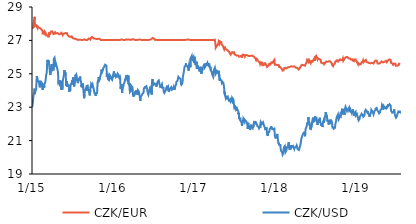
| Category | CZK/EUR | CZK/USD |
|---|---|---|
| 2015-01-02 | 27.7 | 23.001 |
| 2015-01-05 | 27.675 | 23.225 |
| 2015-01-06 | 27.695 | 23.249 |
| 2015-01-07 | 27.785 | 23.505 |
| 2015-01-08 | 27.865 | 23.68 |
| 2015-01-09 | 28.06 | 23.752 |
| 2015-01-12 | 28.29 | 23.965 |
| 2015-01-13 | 28.41 | 24.112 |
| 2015-01-14 | 28.23 | 23.975 |
| 2015-01-15 | 27.84 | 23.783 |
| 2015-01-16 | 27.79 | 23.977 |
| 2015-01-19 | 27.88 | 24.015 |
| 2015-01-20 | 27.845 | 24.049 |
| 2015-01-21 | 27.945 | 24.104 |
| 2015-01-22 | 27.9 | 24.013 |
| 2015-01-23 | 27.835 | 24.859 |
| 2015-01-26 | 27.755 | 24.68 |
| 2015-01-27 | 27.865 | 24.643 |
| 2015-01-28 | 27.84 | 24.543 |
| 2015-01-29 | 27.8 | 24.562 |
| 2015-01-30 | 27.795 | 24.585 |
| 2015-02-02 | 27.75 | 24.537 |
| 2015-02-03 | 27.75 | 24.388 |
| 2015-02-04 | 27.77 | 24.261 |
| 2015-02-05 | 27.73 | 24.304 |
| 2015-02-06 | 27.695 | 24.19 |
| 2015-02-09 | 27.72 | 24.58 |
| 2015-02-10 | 27.725 | 24.541 |
| 2015-02-11 | 27.68 | 24.462 |
| 2015-02-12 | 27.705 | 24.455 |
| 2015-02-13 | 27.64 | 24.285 |
| 2015-02-16 | 27.64 | 24.224 |
| 2015-02-17 | 27.62 | 24.192 |
| 2015-02-18 | 27.58 | 24.254 |
| 2015-02-19 | 27.37 | 24.033 |
| 2015-02-20 | 27.505 | 24.344 |
| 2015-02-23 | 27.445 | 24.291 |
| 2015-02-24 | 27.48 | 24.257 |
| 2015-02-25 | 27.42 | 24.165 |
| 2015-02-26 | 27.51 | 24.306 |
| 2015-02-27 | 27.43 | 24.401 |
| 2015-03-02 | 27.49 | 24.48 |
| 2015-03-03 | 27.45 | 24.576 |
| 2015-03-04 | 27.465 | 24.683 |
| 2015-03-05 | 27.42 | 24.77 |
| 2015-03-06 | 27.3 | 24.899 |
| 2015-03-09 | 27.25 | 25.093 |
| 2015-03-10 | 27.285 | 25.397 |
| 2015-03-11 | 27.29 | 25.8 |
| 2015-03-12 | 27.305 | 25.735 |
| 2015-03-13 | 27.31 | 25.832 |
| 2015-03-16 | 27.305 | 25.856 |
| 2015-03-17 | 27.185 | 25.565 |
| 2015-03-18 | 27.32 | 25.797 |
| 2015-03-19 | 27.425 | 25.687 |
| 2015-03-20 | 27.48 | 25.5 |
| 2015-03-23 | 27.375 | 25.091 |
| 2015-03-24 | 27.39 | 25.017 |
| 2015-03-25 | 27.375 | 24.923 |
| 2015-03-26 | 27.385 | 24.951 |
| 2015-03-27 | 27.525 | 25.345 |
| 2015-03-30 | 27.475 | 25.333 |
| 2015-03-31 | 27.53 | 25.586 |
| 2015-04-01 | 27.545 | 25.563 |
| 2015-04-02 | 27.57 | 25.456 |
| 2015-04-03 | 27.54 | 25.232 |
| 2015-04-07 | 27.46 | 25.315 |
| 2015-04-08 | 27.375 | 25.205 |
| 2015-04-09 | 27.375 | 25.407 |
| 2015-04-10 | 27.38 | 25.901 |
| 2015-04-13 | 27.395 | 25.963 |
| 2015-04-14 | 27.345 | 25.886 |
| 2015-04-15 | 27.415 | 25.911 |
| 2015-04-16 | 27.485 | 25.662 |
| 2015-04-17 | 27.485 | 25.41 |
| 2015-04-20 | 27.42 | 25.569 |
| 2015-04-21 | 27.42 | 25.627 |
| 2015-04-22 | 27.465 | 25.568 |
| 2015-04-23 | 27.4 | 25.434 |
| 2015-04-24 | 27.455 | 25.366 |
| 2015-04-27 | 27.44 | 25.343 |
| 2015-04-28 | 27.47 | 25.14 |
| 2015-04-29 | 27.435 | 24.939 |
| 2015-04-30 | 27.43 | 24.46 |
| 2015-05-04 | 27.365 | 24.535 |
| 2015-05-05 | 27.36 | 24.61 |
| 2015-05-06 | 27.415 | 24.41 |
| 2015-05-07 | 27.405 | 24.255 |
| 2015-05-11 | 27.395 | 24.582 |
| 2015-05-12 | 27.395 | 24.374 |
| 2015-05-13 | 27.455 | 24.465 |
| 2015-05-14 | 27.455 | 24.038 |
| 2015-05-15 | 27.4 | 24.185 |
| 2015-05-18 | 27.4 | 24.059 |
| 2015-05-19 | 27.355 | 24.471 |
| 2015-05-20 | 27.33 | 24.577 |
| 2015-05-21 | 27.35 | 24.57 |
| 2015-05-22 | 27.395 | 24.543 |
| 2015-05-25 | 27.37 | 24.931 |
| 2015-05-26 | 27.395 | 25.072 |
| 2015-05-27 | 27.405 | 25.226 |
| 2015-05-28 | 27.46 | 25.203 |
| 2015-05-29 | 27.41 | 24.978 |
| 2015-06-01 | 27.44 | 25.078 |
| 2015-06-02 | 27.44 | 24.883 |
| 2015-06-03 | 27.46 | 24.704 |
| 2015-06-04 | 27.465 | 24.263 |
| 2015-06-05 | 27.395 | 24.426 |
| 2015-06-08 | 27.43 | 24.56 |
| 2015-06-09 | 27.36 | 24.328 |
| 2015-06-10 | 27.32 | 24.22 |
| 2015-06-11 | 27.315 | 24.331 |
| 2015-06-12 | 27.3 | 24.328 |
| 2015-06-15 | 27.28 | 24.319 |
| 2015-06-16 | 27.255 | 24.309 |
| 2015-06-17 | 27.24 | 24.148 |
| 2015-06-18 | 27.275 | 23.92 |
| 2015-06-19 | 27.21 | 24.08 |
| 2015-06-22 | 27.205 | 23.981 |
| 2015-06-23 | 27.19 | 24.266 |
| 2015-06-24 | 27.205 | 24.26 |
| 2015-06-25 | 27.23 | 24.297 |
| 2015-06-26 | 27.23 | 24.306 |
| 2015-06-29 | 27.245 | 24.473 |
| 2015-06-30 | 27.245 | 24.347 |
| 2015-07-01 | 27.245 | 24.557 |
| 2015-07-02 | 27.265 | 24.633 |
| 2015-07-03 | 27.14 | 24.46 |
| 2015-07-07 | 27.1 | 24.793 |
| 2015-07-08 | 27.115 | 24.592 |
| 2015-07-09 | 27.11 | 24.528 |
| 2015-07-10 | 27.125 | 24.238 |
| 2015-07-13 | 27.1 | 24.522 |
| 2015-07-14 | 27.08 | 24.55 |
| 2015-07-15 | 27.075 | 24.59 |
| 2015-07-16 | 27.11 | 24.946 |
| 2015-07-17 | 27.055 | 24.843 |
| 2015-07-20 | 27.07 | 24.94 |
| 2015-07-21 | 27.07 | 24.908 |
| 2015-07-22 | 27.065 | 24.827 |
| 2015-07-23 | 27.04 | 24.581 |
| 2015-07-24 | 27.045 | 24.72 |
| 2015-07-27 | 27.03 | 24.444 |
| 2015-07-28 | 27.025 | 24.504 |
| 2015-07-29 | 27.065 | 24.539 |
| 2015-07-30 | 27.05 | 24.691 |
| 2015-07-31 | 27.03 | 24.648 |
| 2015-08-03 | 27.04 | 24.687 |
| 2015-08-04 | 27.055 | 24.649 |
| 2015-08-05 | 27.04 | 24.769 |
| 2015-08-06 | 27.03 | 24.833 |
| 2015-08-07 | 27.025 | 24.706 |
| 2015-08-10 | 27.035 | 24.664 |
| 2015-08-11 | 27.03 | 24.448 |
| 2015-08-12 | 27.02 | 24.227 |
| 2015-08-13 | 27.025 | 24.322 |
| 2015-08-14 | 27.02 | 24.189 |
| 2015-08-17 | 27.02 | 24.339 |
| 2015-08-18 | 27.02 | 24.427 |
| 2015-08-19 | 27.022 | 24.475 |
| 2015-08-20 | 27.023 | 24.163 |
| 2015-08-21 | 27.021 | 23.952 |
| 2015-08-24 | 27.065 | 23.538 |
| 2015-08-25 | 27.11 | 23.564 |
| 2015-08-26 | 27.085 | 23.754 |
| 2015-08-27 | 27.1 | 24.022 |
| 2015-08-28 | 27.05 | 23.999 |
| 2015-08-31 | 27.03 | 24.098 |
| 2015-09-01 | 27.02 | 24.04 |
| 2015-09-02 | 27.02 | 23.987 |
| 2015-09-03 | 27.025 | 24.069 |
| 2015-09-04 | 27.03 | 24.265 |
| 2015-09-07 | 27.025 | 24.249 |
| 2015-09-08 | 27.045 | 24.231 |
| 2015-09-09 | 27.06 | 24.292 |
| 2015-09-10 | 27.04 | 24.17 |
| 2015-09-11 | 27.075 | 24.021 |
| 2015-09-14 | 27.115 | 23.984 |
| 2015-09-15 | 27.085 | 23.922 |
| 2015-09-16 | 27.06 | 24.096 |
| 2015-09-17 | 27.11 | 23.967 |
| 2015-09-18 | 27.07 | 23.707 |
| 2015-09-21 | 27.05 | 24.047 |
| 2015-09-22 | 27.06 | 24.258 |
| 2015-09-23 | 27.09 | 24.291 |
| 2015-09-24 | 27.16 | 24.16 |
| 2015-09-25 | 27.19 | 24.387 |
| 2015-09-29 | 27.21 | 24.286 |
| 2015-09-30 | 27.18 | 24.266 |
| 2015-10-01 | 27.17 | 24.356 |
| 2015-10-02 | 27.16 | 24.334 |
| 2015-10-05 | 27.12 | 24.132 |
| 2015-10-06 | 27.11 | 24.154 |
| 2015-10-07 | 27.095 | 24.051 |
| 2015-10-08 | 27.11 | 24.085 |
| 2015-10-09 | 27.11 | 23.856 |
| 2015-10-12 | 27.105 | 23.834 |
| 2015-10-13 | 27.13 | 23.853 |
| 2015-10-14 | 27.11 | 23.762 |
| 2015-10-15 | 27.08 | 23.677 |
| 2015-10-16 | 27.08 | 23.841 |
| 2015-10-19 | 27.085 | 23.898 |
| 2015-10-20 | 27.08 | 23.809 |
| 2015-10-21 | 27.08 | 23.852 |
| 2015-10-22 | 27.07 | 23.925 |
| 2015-10-23 | 27.075 | 24.45 |
| 2015-10-26 | 27.09 | 24.604 |
| 2015-10-27 | 27.1 | 24.504 |
| 2015-10-29 | 27.11 | 24.803 |
| 2015-10-30 | 27.09 | 24.594 |
| 2015-11-02 | 27.1 | 24.559 |
| 2015-11-03 | 27.1 | 24.689 |
| 2015-11-04 | 27.075 | 24.78 |
| 2015-11-05 | 27.045 | 24.853 |
| 2015-11-06 | 27.03 | 24.892 |
| 2015-11-09 | 27.04 | 25.09 |
| 2015-11-10 | 27.045 | 25.249 |
| 2015-11-11 | 27.025 | 25.218 |
| 2015-11-12 | 27.035 | 25.205 |
| 2015-11-13 | 27.03 | 25.107 |
| 2015-11-16 | 27.03 | 25.207 |
| 2015-11-18 | 27.03 | 25.34 |
| 2015-11-19 | 27.025 | 25.282 |
| 2015-11-20 | 27.03 | 25.289 |
| 2015-11-23 | 27.025 | 25.422 |
| 2015-11-24 | 27.03 | 25.376 |
| 2015-11-25 | 27.025 | 25.527 |
| 2015-11-26 | 27.03 | 25.463 |
| 2015-11-27 | 27.025 | 25.54 |
| 2015-11-30 | 27.03 | 25.545 |
| 2015-12-01 | 27.025 | 25.493 |
| 2015-12-02 | 27.025 | 25.492 |
| 2015-12-03 | 27.035 | 25.326 |
| 2015-12-04 | 27.035 | 24.802 |
| 2015-12-07 | 27.02 | 24.997 |
| 2015-12-08 | 27.02 | 24.841 |
| 2015-12-09 | 27.02 | 24.688 |
| 2015-12-10 | 27.02 | 24.69 |
| 2015-12-11 | 27.025 | 24.676 |
| 2015-12-14 | 27.02 | 24.62 |
| 2015-12-15 | 27.02 | 24.57 |
| 2015-12-16 | 27.03 | 24.726 |
| 2015-12-17 | 27.03 | 24.935 |
| 2015-12-18 | 27.03 | 24.947 |
| 2015-12-21 | 27.025 | 24.862 |
| 2015-12-22 | 27.03 | 24.679 |
| 2015-12-23 | 27.03 | 24.762 |
| 2015-12-28 | 27.02 | 24.645 |
| 2015-12-29 | 27.03 | 24.679 |
| 2015-12-30 | 27.025 | 24.728 |
| 2015-12-31 | 27.025 | 24.824 |
| 2016-01-04 | 27.02 | 24.794 |
| 2016-01-05 | 27.02 | 25.145 |
| 2016-01-06 | 27.025 | 25.196 |
| 2016-01-07 | 27.03 | 24.873 |
| 2016-01-08 | 27.02 | 24.873 |
| 2016-01-11 | 27.02 | 24.815 |
| 2016-01-12 | 27.02 | 24.937 |
| 2016-01-13 | 27.02 | 24.983 |
| 2016-01-14 | 27.02 | 24.804 |
| 2016-01-15 | 27.02 | 24.756 |
| 2016-01-18 | 27.035 | 24.821 |
| 2016-01-19 | 27.025 | 24.865 |
| 2016-01-20 | 27.04 | 24.789 |
| 2016-01-21 | 27.065 | 24.844 |
| 2016-01-22 | 27.025 | 25.002 |
| 2016-01-25 | 27.02 | 24.98 |
| 2016-01-26 | 27.02 | 24.928 |
| 2016-01-27 | 27.025 | 24.82 |
| 2016-01-28 | 27.02 | 24.78 |
| 2016-01-29 | 27.025 | 24.76 |
| 2016-02-01 | 27.02 | 24.823 |
| 2016-02-02 | 27.025 | 24.748 |
| 2016-02-03 | 27.02 | 24.72 |
| 2016-02-04 | 27.02 | 24.11 |
| 2016-02-05 | 27.035 | 24.134 |
| 2016-02-08 | 27.06 | 24.379 |
| 2016-02-09 | 27.06 | 24.09 |
| 2016-02-10 | 27.03 | 24.006 |
| 2016-02-11 | 27.07 | 23.857 |
| 2016-02-12 | 27.065 | 24.004 |
| 2016-02-15 | 27.035 | 24.182 |
| 2016-02-16 | 27.03 | 24.214 |
| 2016-02-17 | 27.03 | 24.276 |
| 2016-02-18 | 27.02 | 24.375 |
| 2016-02-19 | 27.025 | 24.351 |
| 2016-02-22 | 27.02 | 24.505 |
| 2016-02-23 | 27.03 | 24.57 |
| 2016-02-24 | 27.045 | 24.629 |
| 2016-02-25 | 27.05 | 24.526 |
| 2016-02-26 | 27.065 | 24.589 |
| 2016-02-29 | 27.055 | 24.848 |
| 2016-03-01 | 27.055 | 24.879 |
| 2016-03-02 | 27.045 | 24.933 |
| 2016-03-03 | 27.055 | 24.819 |
| 2016-03-04 | 27.06 | 24.661 |
| 2016-03-07 | 27.055 | 24.692 |
| 2016-03-08 | 27.06 | 24.541 |
| 2016-03-09 | 27.045 | 24.64 |
| 2016-03-10 | 27.035 | 24.899 |
| 2016-03-11 | 27.06 | 24.398 |
| 2016-03-14 | 27.05 | 24.324 |
| 2016-03-15 | 27.045 | 24.347 |
| 2016-03-16 | 27.05 | 24.45 |
| 2016-03-17 | 27.045 | 23.908 |
| 2016-03-18 | 27.035 | 23.966 |
| 2016-03-21 | 27.03 | 23.98 |
| 2016-03-22 | 27.035 | 24.117 |
| 2016-03-23 | 27.035 | 24.201 |
| 2016-03-24 | 27.065 | 24.267 |
| 2016-03-29 | 27.075 | 24.183 |
| 2016-03-30 | 27.075 | 23.896 |
| 2016-03-31 | 27.055 | 23.757 |
| 2016-04-01 | 27.03 | 23.64 |
| 2016-04-04 | 27.05 | 23.766 |
| 2016-04-05 | 27.035 | 23.774 |
| 2016-04-06 | 27.03 | 23.834 |
| 2016-04-07 | 27.025 | 23.775 |
| 2016-04-08 | 27.02 | 23.771 |
| 2016-04-11 | 27.025 | 23.724 |
| 2016-04-12 | 27.03 | 23.717 |
| 2016-04-13 | 27.035 | 23.923 |
| 2016-04-14 | 27.03 | 24.018 |
| 2016-04-15 | 27.025 | 23.948 |
| 2016-04-18 | 27.02 | 23.889 |
| 2016-04-19 | 27.02 | 23.821 |
| 2016-04-20 | 27.02 | 23.743 |
| 2016-04-21 | 27.025 | 23.798 |
| 2016-04-22 | 27.045 | 24.014 |
| 2016-04-25 | 27.045 | 24.014 |
| 2016-04-26 | 27.025 | 23.946 |
| 2016-04-27 | 27.035 | 23.916 |
| 2016-04-28 | 27.045 | 23.811 |
| 2016-04-29 | 27.04 | 23.714 |
| 2016-05-02 | 27.05 | 23.534 |
| 2016-05-03 | 27.035 | 23.383 |
| 2016-05-04 | 27.03 | 23.457 |
| 2016-05-05 | 27.03 | 23.628 |
| 2016-05-06 | 27.02 | 23.654 |
| 2016-05-09 | 27.02 | 23.717 |
| 2016-05-10 | 27.025 | 23.762 |
| 2016-05-11 | 27.02 | 23.681 |
| 2016-05-12 | 27.025 | 23.729 |
| 2016-05-13 | 27.02 | 23.81 |
| 2016-05-16 | 27.02 | 23.859 |
| 2016-05-17 | 27.02 | 23.873 |
| 2016-05-18 | 27.02 | 23.955 |
| 2016-05-19 | 27.02 | 24.133 |
| 2016-05-20 | 27.025 | 24.083 |
| 2016-05-23 | 27.035 | 24.106 |
| 2016-05-24 | 27.025 | 24.192 |
| 2016-05-25 | 27.03 | 24.253 |
| 2016-05-26 | 27.025 | 24.192 |
| 2016-05-27 | 27.03 | 24.203 |
| 2016-05-30 | 27.02 | 24.255 |
| 2016-05-31 | 27.02 | 24.223 |
| 2016-06-01 | 27.025 | 24.186 |
| 2016-06-02 | 27.03 | 24.167 |
| 2016-06-03 | 27.025 | 24.221 |
| 2016-06-06 | 27.025 | 23.805 |
| 2016-06-07 | 27.02 | 23.815 |
| 2016-06-08 | 27.02 | 23.743 |
| 2016-06-09 | 27.02 | 23.815 |
| 2016-06-10 | 27.025 | 23.905 |
| 2016-06-13 | 27.035 | 23.997 |
| 2016-06-14 | 27.045 | 24.088 |
| 2016-06-15 | 27.075 | 24.103 |
| 2016-06-16 | 27.065 | 24.224 |
| 2016-06-17 | 27.07 | 24.052 |
| 2016-06-20 | 27.06 | 23.877 |
| 2016-06-21 | 27.065 | 23.923 |
| 2016-06-22 | 27.07 | 23.976 |
| 2016-06-23 | 27.06 | 23.761 |
| 2016-06-24 | 27.1 | 24.491 |
| 2016-06-27 | 27.15 | 24.692 |
| 2016-06-28 | 27.11 | 24.484 |
| 2016-06-29 | 27.115 | 24.443 |
| 2016-06-30 | 27.13 | 24.433 |
| 2016-07-01 | 27.095 | 24.335 |
| 2016-07-04 | 27.095 | 24.322 |
| 2016-07-07 | 27.05 | 24.417 |
| 2016-07-08 | 27.03 | 24.421 |
| 2016-07-11 | 27.035 | 24.458 |
| 2016-07-12 | 27.035 | 24.367 |
| 2016-07-13 | 27.035 | 24.415 |
| 2016-07-14 | 27.04 | 24.235 |
| 2016-07-15 | 27.03 | 24.284 |
| 2016-07-18 | 27.025 | 24.446 |
| 2016-07-19 | 27.025 | 24.488 |
| 2016-07-20 | 27.02 | 24.532 |
| 2016-07-21 | 27.025 | 24.53 |
| 2016-07-22 | 27.025 | 24.535 |
| 2016-07-25 | 27.02 | 24.601 |
| 2016-07-26 | 27.025 | 24.573 |
| 2016-07-27 | 27.035 | 24.594 |
| 2016-07-28 | 27.045 | 24.382 |
| 2016-07-29 | 27.03 | 24.324 |
| 2016-08-01 | 27.03 | 24.212 |
| 2016-08-02 | 27.03 | 24.147 |
| 2016-08-03 | 27.035 | 24.143 |
| 2016-08-04 | 27.03 | 24.273 |
| 2016-08-05 | 27.02 | 24.219 |
| 2016-08-08 | 27.03 | 24.38 |
| 2016-08-09 | 27.025 | 24.392 |
| 2016-08-10 | 27.025 | 24.17 |
| 2016-08-11 | 27.02 | 24.224 |
| 2016-08-12 | 27.02 | 24.211 |
| 2016-08-15 | 27.02 | 24.162 |
| 2016-08-16 | 27.02 | 23.918 |
| 2016-08-17 | 27.025 | 23.973 |
| 2016-08-18 | 27.025 | 23.865 |
| 2016-08-19 | 27.02 | 23.851 |
| 2016-08-22 | 27.025 | 23.901 |
| 2016-08-23 | 27.025 | 23.832 |
| 2016-08-24 | 27.025 | 23.984 |
| 2016-08-25 | 27.03 | 23.938 |
| 2016-08-26 | 27.02 | 23.928 |
| 2016-08-29 | 27.02 | 24.192 |
| 2016-08-30 | 27.025 | 24.196 |
| 2016-08-31 | 27.03 | 24.286 |
| 2016-09-01 | 27.025 | 24.252 |
| 2016-09-02 | 27.02 | 24.138 |
| 2016-09-05 | 27.02 | 24.218 |
| 2016-09-06 | 27.02 | 24.211 |
| 2016-09-07 | 27.02 | 24.041 |
| 2016-09-08 | 27.02 | 23.921 |
| 2016-09-09 | 27.02 | 23.975 |
| 2016-09-12 | 27.025 | 24.074 |
| 2016-09-13 | 27.02 | 24.031 |
| 2016-09-14 | 27.025 | 24.083 |
| 2016-09-15 | 27.025 | 24.017 |
| 2016-09-16 | 27.025 | 24.073 |
| 2016-09-19 | 27.02 | 24.197 |
| 2016-09-20 | 27.02 | 24.16 |
| 2016-09-21 | 27.02 | 24.232 |
| 2016-09-22 | 27.02 | 24.046 |
| 2016-09-23 | 27.02 | 24.096 |
| 2016-09-26 | 27.02 | 23.992 |
| 2016-09-27 | 27.025 | 24.088 |
| 2016-09-29 | 27.02 | 24.076 |
| 2016-09-30 | 27.02 | 24.21 |
| 2016-10-03 | 27.02 | 24.049 |
| 2016-10-04 | 27.02 | 24.207 |
| 2016-10-05 | 27.02 | 24.085 |
| 2016-10-06 | 27.02 | 24.156 |
| 2016-10-07 | 27.02 | 24.249 |
| 2016-10-10 | 27.02 | 24.209 |
| 2016-10-11 | 27.02 | 24.387 |
| 2016-10-12 | 27.025 | 24.521 |
| 2016-10-13 | 27.02 | 24.478 |
| 2016-10-14 | 27.025 | 24.561 |
| 2016-10-17 | 27.025 | 24.584 |
| 2016-10-18 | 27.02 | 24.578 |
| 2016-10-19 | 27.02 | 24.611 |
| 2016-10-20 | 27.02 | 24.603 |
| 2016-10-21 | 27.02 | 24.82 |
| 2016-10-24 | 27.02 | 24.809 |
| 2016-10-25 | 27.02 | 24.846 |
| 2016-10-26 | 27.02 | 24.736 |
| 2016-10-27 | 27.02 | 24.729 |
| 2016-10-31 | 27.025 | 24.687 |
| 2016-11-01 | 27.025 | 24.508 |
| 2016-11-02 | 27.02 | 24.356 |
| 2016-11-03 | 27.02 | 24.426 |
| 2016-11-04 | 27.02 | 24.359 |
| 2016-11-07 | 27.02 | 24.424 |
| 2016-11-08 | 27.02 | 24.478 |
| 2016-11-09 | 27.025 | 24.521 |
| 2016-11-10 | 27.02 | 24.804 |
| 2016-11-11 | 27.055 | 24.802 |
| 2016-11-14 | 27.025 | 25.08 |
| 2016-11-15 | 27.03 | 25.106 |
| 2016-11-16 | 27.035 | 25.257 |
| 2016-11-18 | 27.035 | 25.436 |
| 2016-11-21 | 27.03 | 25.424 |
| 2016-11-22 | 27.045 | 25.474 |
| 2016-11-23 | 27.025 | 25.488 |
| 2016-11-24 | 27.035 | 25.629 |
| 2016-11-25 | 27.04 | 25.532 |
| 2016-11-28 | 27.045 | 25.538 |
| 2016-11-29 | 27.05 | 25.574 |
| 2016-11-30 | 27.06 | 25.455 |
| 2016-12-01 | 27.06 | 25.465 |
| 2016-12-02 | 27.06 | 25.426 |
| 2016-12-05 | 27.055 | 25.276 |
| 2016-12-06 | 27.045 | 25.191 |
| 2016-12-07 | 27.035 | 25.195 |
| 2016-12-08 | 27.04 | 25.134 |
| 2016-12-09 | 27.025 | 25.588 |
| 2016-12-12 | 27.025 | 25.511 |
| 2016-12-13 | 27.02 | 25.461 |
| 2016-12-14 | 27.025 | 25.386 |
| 2016-12-15 | 27.02 | 25.932 |
| 2016-12-16 | 27.02 | 25.882 |
| 2016-12-19 | 27.02 | 25.926 |
| 2016-12-20 | 27.02 | 26.068 |
| 2016-12-21 | 27.02 | 25.927 |
| 2016-12-22 | 27.02 | 25.869 |
| 2016-12-23 | 27.02 | 25.865 |
| 2016-12-27 | 27.02 | 25.866 |
| 2016-12-28 | 27.04 | 26 |
| 2016-12-29 | 27.02 | 25.849 |
| 2016-12-30 | 27.02 | 25.639 |
| 2017-01-02 | 27.02 | 25.819 |
| 2017-01-03 | 27.02 | 26.017 |
| 2017-01-04 | 27.02 | 25.889 |
| 2017-01-05 | 27.02 | 25.714 |
| 2017-01-06 | 27.02 | 25.516 |
| 2017-01-09 | 27.02 | 25.697 |
| 2017-01-10 | 27.02 | 25.571 |
| 2017-01-11 | 27.02 | 25.721 |
| 2017-01-12 | 27.02 | 25.3 |
| 2017-01-13 | 27.02 | 25.347 |
| 2017-01-16 | 27.02 | 25.503 |
| 2017-01-17 | 27.02 | 25.291 |
| 2017-01-18 | 27.02 | 25.335 |
| 2017-01-19 | 27.02 | 25.329 |
| 2017-01-20 | 27.02 | 25.414 |
| 2017-01-23 | 27.025 | 25.22 |
| 2017-01-24 | 27.02 | 25.141 |
| 2017-01-25 | 27.02 | 25.144 |
| 2017-01-26 | 27.02 | 25.252 |
| 2017-01-27 | 27.02 | 25.297 |
| 2017-01-30 | 27.02 | 25.421 |
| 2017-01-31 | 27.02 | 25.12 |
| 2017-02-01 | 27.02 | 25.074 |
| 2017-02-02 | 27.02 | 24.992 |
| 2017-02-03 | 27.02 | 25.155 |
| 2017-02-06 | 27.02 | 25.219 |
| 2017-02-07 | 27.02 | 25.306 |
| 2017-02-08 | 27.02 | 25.333 |
| 2017-02-09 | 27.02 | 25.268 |
| 2017-02-10 | 27.02 | 25.422 |
| 2017-02-13 | 27.02 | 25.421 |
| 2017-02-14 | 27.02 | 25.437 |
| 2017-02-15 | 27.02 | 25.596 |
| 2017-02-16 | 27.02 | 25.36 |
| 2017-02-17 | 27.02 | 25.372 |
| 2017-02-20 | 27.02 | 25.449 |
| 2017-02-21 | 27.02 | 25.644 |
| 2017-02-22 | 27.02 | 25.7 |
| 2017-02-23 | 27.02 | 25.556 |
| 2017-02-24 | 27.02 | 25.468 |
| 2017-02-27 | 27.02 | 25.522 |
| 2017-02-28 | 27.02 | 25.497 |
| 2017-03-01 | 27.02 | 25.654 |
| 2017-03-02 | 27.02 | 25.695 |
| 2017-03-03 | 27.02 | 25.574 |
| 2017-03-06 | 27.02 | 25.506 |
| 2017-03-07 | 27.02 | 25.547 |
| 2017-03-08 | 27.02 | 25.631 |
| 2017-03-09 | 27.02 | 25.613 |
| 2017-03-10 | 27.02 | 25.482 |
| 2017-03-13 | 27.02 | 25.339 |
| 2017-03-14 | 27.02 | 25.415 |
| 2017-03-15 | 27.02 | 25.434 |
| 2017-03-16 | 27.02 | 25.195 |
| 2017-03-17 | 27.02 | 25.154 |
| 2017-03-20 | 27.02 | 25.129 |
| 2017-03-21 | 27.02 | 25.009 |
| 2017-03-22 | 27.02 | 25.003 |
| 2017-03-23 | 27.02 | 25.05 |
| 2017-03-24 | 27.02 | 25.008 |
| 2017-03-27 | 27.02 | 24.813 |
| 2017-03-28 | 27.02 | 24.883 |
| 2017-03-29 | 27.02 | 25.14 |
| 2017-03-30 | 27.02 | 25.159 |
| 2017-03-31 | 27.03 | 25.282 |
| 2017-04-03 | 27.045 | 25.367 |
| 2017-04-04 | 27.055 | 25.404 |
| 2017-04-05 | 27.06 | 25.37 |
| 2017-04-06 | 26.75 | 25.076 |
| 2017-04-07 | 26.565 | 24.999 |
| 2017-04-10 | 26.53 | 25.082 |
| 2017-04-11 | 26.66 | 25.112 |
| 2017-04-12 | 26.695 | 25.172 |
| 2017-04-13 | 26.705 | 25.122 |
| 2017-04-18 | 26.76 | 25.053 |
| 2017-04-19 | 26.795 | 24.985 |
| 2017-04-20 | 26.91 | 25.043 |
| 2017-04-21 | 26.935 | 25.179 |
| 2017-04-24 | 26.795 | 24.706 |
| 2017-04-25 | 26.77 | 24.58 |
| 2017-04-26 | 26.945 | 24.735 |
| 2017-04-27 | 26.935 | 24.752 |
| 2017-04-28 | 26.92 | 24.629 |
| 2017-05-02 | 26.89 | 24.639 |
| 2017-05-03 | 26.87 | 24.607 |
| 2017-05-04 | 26.77 | 24.499 |
| 2017-05-05 | 26.78 | 24.433 |
| 2017-05-09 | 26.67 | 24.497 |
| 2017-05-10 | 26.64 | 24.486 |
| 2017-05-11 | 26.6 | 24.495 |
| 2017-05-12 | 26.575 | 24.435 |
| 2017-05-15 | 26.47 | 24.124 |
| 2017-05-16 | 26.42 | 23.888 |
| 2017-05-17 | 26.435 | 23.778 |
| 2017-05-18 | 26.63 | 23.927 |
| 2017-05-19 | 26.5 | 23.71 |
| 2017-05-22 | 26.485 | 23.557 |
| 2017-05-23 | 26.48 | 23.615 |
| 2017-05-24 | 26.465 | 23.642 |
| 2017-05-25 | 26.41 | 23.552 |
| 2017-05-26 | 26.435 | 23.606 |
| 2017-05-29 | 26.435 | 23.627 |
| 2017-05-30 | 26.465 | 23.69 |
| 2017-05-31 | 26.42 | 23.545 |
| 2017-06-01 | 26.395 | 23.554 |
| 2017-06-02 | 26.36 | 23.501 |
| 2017-06-05 | 26.325 | 23.401 |
| 2017-06-06 | 26.335 | 23.393 |
| 2017-06-07 | 26.315 | 23.459 |
| 2017-06-08 | 26.27 | 23.392 |
| 2017-06-09 | 26.22 | 23.463 |
| 2017-06-12 | 26.2 | 23.348 |
| 2017-06-13 | 26.145 | 23.308 |
| 2017-06-14 | 26.165 | 23.354 |
| 2017-06-15 | 26.21 | 23.468 |
| 2017-06-16 | 26.23 | 23.49 |
| 2017-06-19 | 26.17 | 23.369 |
| 2017-06-20 | 26.295 | 23.568 |
| 2017-06-21 | 26.265 | 23.565 |
| 2017-06-22 | 26.27 | 23.522 |
| 2017-06-23 | 26.295 | 23.53 |
| 2017-06-26 | 26.24 | 23.457 |
| 2017-06-27 | 26.27 | 23.29 |
| 2017-06-28 | 26.325 | 23.141 |
| 2017-06-29 | 26.285 | 23.032 |
| 2017-06-30 | 26.195 | 22.952 |
| 2017-07-03 | 26.14 | 22.993 |
| 2017-07-04 | 26.13 | 23.017 |
| 2017-07-07 | 26.08 | 22.852 |
| 2017-07-10 | 26.095 | 22.917 |
| 2017-07-11 | 26.125 | 22.907 |
| 2017-07-12 | 26.11 | 22.804 |
| 2017-07-13 | 26.12 | 22.878 |
| 2017-07-14 | 26.075 | 22.842 |
| 2017-07-17 | 26.09 | 22.762 |
| 2017-07-18 | 26.08 | 22.57 |
| 2017-07-19 | 26.035 | 22.572 |
| 2017-07-20 | 26.04 | 22.671 |
| 2017-07-21 | 26.02 | 22.347 |
| 2017-07-24 | 26.025 | 22.344 |
| 2017-07-25 | 26.02 | 22.25 |
| 2017-07-26 | 26.045 | 22.371 |
| 2017-07-27 | 26.045 | 22.269 |
| 2017-07-28 | 26.05 | 22.209 |
| 2017-07-31 | 26.08 | 22.24 |
| 2017-08-01 | 26.13 | 22.123 |
| 2017-08-02 | 26.125 | 22.099 |
| 2017-08-03 | 25.965 | 21.89 |
| 2017-08-04 | 26.065 | 21.961 |
| 2017-08-07 | 26.115 | 22.135 |
| 2017-08-08 | 26.15 | 22.134 |
| 2017-08-09 | 26.16 | 22.301 |
| 2017-08-10 | 26.16 | 22.297 |
| 2017-08-11 | 26.155 | 22.232 |
| 2017-08-14 | 26.12 | 22.143 |
| 2017-08-15 | 26.14 | 22.26 |
| 2017-08-16 | 26.045 | 22.243 |
| 2017-08-17 | 26.01 | 22.24 |
| 2017-08-18 | 26.11 | 22.243 |
| 2017-08-21 | 26.085 | 22.177 |
| 2017-08-22 | 26.085 | 22.16 |
| 2017-08-23 | 26.125 | 22.14 |
| 2017-08-24 | 26.1 | 22.106 |
| 2017-08-25 | 26.085 | 22.098 |
| 2017-08-28 | 26.1 | 21.887 |
| 2017-08-29 | 26.14 | 21.697 |
| 2017-08-30 | 26.045 | 21.849 |
| 2017-08-31 | 26.105 | 22.073 |
| 2017-09-01 | 26.075 | 21.871 |
| 2017-09-04 | 26.06 | 21.895 |
| 2017-09-05 | 26.075 | 21.928 |
| 2017-09-06 | 26.11 | 21.88 |
| 2017-09-07 | 26.11 | 21.801 |
| 2017-09-08 | 26.1 | 21.641 |
| 2017-09-11 | 26.075 | 21.736 |
| 2017-09-12 | 26.105 | 21.87 |
| 2017-09-13 | 26.1 | 21.787 |
| 2017-09-14 | 26.1 | 21.953 |
| 2017-09-15 | 26.08 | 21.794 |
| 2017-09-18 | 26.09 | 21.836 |
| 2017-09-19 | 26.105 | 21.809 |
| 2017-09-20 | 26.09 | 21.734 |
| 2017-09-21 | 26.085 | 21.891 |
| 2017-09-22 | 26.045 | 21.771 |
| 2017-09-25 | 26.035 | 21.937 |
| 2017-09-26 | 26.055 | 22.103 |
| 2017-09-27 | 26.035 | 22.176 |
| 2017-09-29 | 25.975 | 22.003 |
| 2017-10-02 | 25.995 | 22.135 |
| 2017-10-03 | 25.93 | 22.065 |
| 2017-10-04 | 25.885 | 21.97 |
| 2017-10-05 | 25.835 | 22.003 |
| 2017-10-06 | 25.815 | 22.05 |
| 2017-10-09 | 25.89 | 22.044 |
| 2017-10-10 | 25.9 | 21.96 |
| 2017-10-11 | 25.88 | 21.878 |
| 2017-10-12 | 25.89 | 21.837 |
| 2017-10-13 | 25.81 | 21.852 |
| 2017-10-16 | 25.765 | 21.828 |
| 2017-10-17 | 25.735 | 21.885 |
| 2017-10-18 | 25.705 | 21.881 |
| 2017-10-19 | 25.725 | 21.736 |
| 2017-10-20 | 25.69 | 21.739 |
| 2017-10-23 | 25.64 | 21.84 |
| 2017-10-24 | 25.58 | 21.753 |
| 2017-10-25 | 25.59 | 21.715 |
| 2017-10-26 | 25.585 | 21.779 |
| 2017-10-27 | 25.67 | 22.117 |
| 2017-10-30 | 25.645 | 22.086 |
| 2017-10-31 | 25.67 | 22.06 |
| 2017-11-01 | 25.555 | 22.008 |
| 2017-11-02 | 25.56 | 21.949 |
| 2017-11-03 | 25.65 | 22.006 |
| 2017-11-06 | 25.61 | 22.098 |
| 2017-11-07 | 25.59 | 22.132 |
| 2017-11-08 | 25.56 | 22.053 |
| 2017-11-09 | 25.53 | 21.954 |
| 2017-11-10 | 25.545 | 21.923 |
| 2017-11-13 | 25.565 | 21.929 |
| 2017-11-14 | 25.565 | 21.766 |
| 2017-11-15 | 25.67 | 21.684 |
| 2017-11-16 | 25.56 | 21.712 |
| 2017-11-20 | 25.565 | 21.701 |
| 2017-11-21 | 25.53 | 21.791 |
| 2017-11-22 | 25.47 | 21.677 |
| 2017-11-23 | 25.46 | 21.487 |
| 2017-11-24 | 25.41 | 21.392 |
| 2017-11-27 | 25.43 | 21.279 |
| 2017-11-28 | 25.46 | 21.418 |
| 2017-11-29 | 25.475 | 21.542 |
| 2017-11-30 | 25.495 | 21.519 |
| 2017-12-01 | 25.525 | 21.475 |
| 2017-12-04 | 25.56 | 21.541 |
| 2017-12-05 | 25.655 | 21.656 |
| 2017-12-06 | 25.635 | 21.695 |
| 2017-12-07 | 25.61 | 21.727 |
| 2017-12-08 | 25.555 | 21.765 |
| 2017-12-11 | 25.6 | 21.705 |
| 2017-12-12 | 25.625 | 21.776 |
| 2017-12-13 | 25.65 | 21.86 |
| 2017-12-14 | 25.685 | 21.682 |
| 2017-12-15 | 25.68 | 21.75 |
| 2017-12-18 | 25.685 | 21.775 |
| 2017-12-19 | 25.66 | 21.702 |
| 2017-12-20 | 25.675 | 21.677 |
| 2017-12-21 | 25.715 | 21.684 |
| 2017-12-22 | 25.75 | 21.725 |
| 2017-12-27 | 25.84 | 21.723 |
| 2017-12-28 | 25.645 | 21.489 |
| 2017-12-29 | 25.54 | 21.291 |
| 2018-01-02 | 25.495 | 21.13 |
| 2018-01-03 | 25.545 | 21.238 |
| 2018-01-04 | 25.51 | 21.16 |
| 2018-01-05 | 25.595 | 21.248 |
| 2018-01-08 | 25.525 | 21.324 |
| 2018-01-09 | 25.535 | 21.399 |
| 2018-01-10 | 25.565 | 21.315 |
| 2018-01-11 | 25.545 | 21.256 |
| 2018-01-12 | 25.52 | 21.025 |
| 2018-01-15 | 25.53 | 20.796 |
| 2018-01-16 | 25.515 | 20.863 |
| 2018-01-17 | 25.445 | 20.852 |
| 2018-01-18 | 25.37 | 20.742 |
| 2018-01-19 | 25.43 | 20.749 |
| 2018-01-22 | 25.4 | 20.752 |
| 2018-01-23 | 25.405 | 20.742 |
| 2018-01-24 | 25.375 | 20.543 |
| 2018-01-25 | 25.38 | 20.454 |
| 2018-01-26 | 25.355 | 20.392 |
| 2018-01-29 | 25.295 | 20.432 |
| 2018-01-30 | 25.33 | 20.394 |
| 2018-01-31 | 25.27 | 20.291 |
| 2018-02-01 | 25.265 | 20.281 |
| 2018-02-02 | 25.19 | 20.163 |
| 2018-02-05 | 25.2 | 20.256 |
| 2018-02-06 | 25.23 | 20.464 |
| 2018-02-07 | 25.23 | 20.448 |
| 2018-02-08 | 25.245 | 20.595 |
| 2018-02-09 | 25.335 | 20.645 |
| 2018-02-12 | 25.355 | 20.677 |
| 2018-02-13 | 25.385 | 20.583 |
| 2018-02-14 | 25.36 | 20.539 |
| 2018-02-15 | 25.37 | 20.307 |
| 2018-02-16 | 25.34 | 20.327 |
| 2018-02-19 | 25.325 | 20.406 |
| 2018-02-20 | 25.315 | 20.515 |
| 2018-02-21 | 25.36 | 20.604 |
| 2018-02-22 | 25.315 | 20.623 |
| 2018-02-23 | 25.335 | 20.603 |
| 2018-02-26 | 25.39 | 20.608 |
| 2018-02-27 | 25.405 | 20.652 |
| 2018-02-28 | 25.42 | 20.816 |
| 2018-03-01 | 25.435 | 20.898 |
| 2018-03-02 | 25.41 | 20.638 |
| 2018-03-05 | 25.405 | 20.642 |
| 2018-03-06 | 25.38 | 20.45 |
| 2018-03-07 | 25.415 | 20.47 |
| 2018-03-08 | 25.43 | 20.472 |
| 2018-03-09 | 25.455 | 20.717 |
| 2018-03-12 | 25.45 | 20.688 |
| 2018-03-13 | 25.47 | 20.577 |
| 2018-03-14 | 25.445 | 20.573 |
| 2018-03-15 | 25.415 | 20.594 |
| 2018-03-16 | 25.415 | 20.666 |
| 2018-03-19 | 25.43 | 20.661 |
| 2018-03-20 | 25.42 | 20.707 |
| 2018-03-21 | 25.42 | 20.689 |
| 2018-03-22 | 25.4 | 20.624 |
| 2018-03-23 | 25.405 | 20.586 |
| 2018-03-26 | 25.445 | 20.506 |
| 2018-03-27 | 25.475 | 20.586 |
| 2018-03-28 | 25.46 | 20.533 |
| 2018-03-29 | 25.43 | 20.641 |
| 2018-04-03 | 25.365 | 20.608 |
| 2018-04-04 | 25.34 | 20.645 |
| 2018-04-05 | 25.325 | 20.655 |
| 2018-04-06 | 25.34 | 20.714 |
| 2018-04-09 | 25.355 | 20.608 |
| 2018-04-10 | 25.335 | 20.497 |
| 2018-04-11 | 25.325 | 20.449 |
| 2018-04-12 | 25.315 | 20.548 |
| 2018-04-13 | 25.305 | 20.545 |
| 2018-04-16 | 25.26 | 20.435 |
| 2018-04-17 | 25.255 | 20.439 |
| 2018-04-18 | 25.3 | 20.424 |
| 2018-04-19 | 25.325 | 20.454 |
| 2018-04-20 | 25.34 | 20.584 |
| 2018-04-23 | 25.41 | 20.763 |
| 2018-04-24 | 25.435 | 20.827 |
| 2018-04-25 | 25.465 | 20.899 |
| 2018-04-26 | 25.475 | 20.944 |
| 2018-04-27 | 25.47 | 21.102 |
| 2018-04-30 | 25.54 | 21.144 |
| 2018-05-02 | 25.595 | 21.319 |
| 2018-05-03 | 25.58 | 21.332 |
| 2018-05-04 | 25.505 | 21.31 |
| 2018-05-07 | 25.515 | 21.438 |
| 2018-05-09 | 25.565 | 21.525 |
| 2018-05-10 | 25.495 | 21.465 |
| 2018-05-11 | 25.505 | 21.37 |
| 2018-05-14 | 25.49 | 21.264 |
| 2018-05-15 | 25.55 | 21.501 |
| 2018-05-16 | 25.545 | 21.679 |
| 2018-05-17 | 25.56 | 21.646 |
| 2018-05-18 | 25.59 | 21.718 |
| 2018-05-21 | 25.68 | 21.84 |
| 2018-05-22 | 25.7 | 21.791 |
| 2018-05-23 | 25.815 | 22.041 |
| 2018-05-24 | 25.81 | 22.011 |
| 2018-05-25 | 25.765 | 22.07 |
| 2018-05-28 | 25.73 | 22.095 |
| 2018-05-29 | 25.905 | 22.413 |
| 2018-05-30 | 25.835 | 22.202 |
| 2018-05-31 | 25.79 | 22.05 |
| 2018-06-01 | 25.83 | 22.137 |
| 2018-06-04 | 25.7 | 21.897 |
| 2018-06-05 | 25.65 | 21.971 |
| 2018-06-06 | 25.645 | 21.798 |
| 2018-06-07 | 25.64 | 21.662 |
| 2018-06-08 | 25.795 | 21.944 |
| 2018-06-11 | 25.68 | 21.781 |
| 2018-06-12 | 25.65 | 21.757 |
| 2018-06-13 | 25.71 | 21.856 |
| 2018-06-14 | 25.65 | 21.866 |
| 2018-06-15 | 25.71 | 22.171 |
| 2018-06-18 | 25.74 | 22.165 |
| 2018-06-19 | 25.81 | 22.373 |
| 2018-06-20 | 25.835 | 22.316 |
| 2018-06-21 | 25.865 | 22.413 |
| 2018-06-22 | 25.79 | 22.139 |
| 2018-06-25 | 25.935 | 22.172 |
| 2018-06-26 | 25.9 | 22.188 |
| 2018-06-27 | 25.77 | 22.184 |
| 2018-06-28 | 26 | 22.448 |
| 2018-06-29 | 26.02 | 22.318 |
| 2018-07-02 | 26 | 22.343 |
| 2018-07-03 | 26.075 | 22.356 |
| 2018-07-04 | 26.03 | 22.357 |
| 2018-07-09 | 25.86 | 21.934 |
| 2018-07-10 | 25.9 | 22.113 |
| 2018-07-11 | 25.93 | 22.099 |
| 2018-07-12 | 25.94 | 22.25 |
| 2018-07-13 | 25.92 | 22.262 |
| 2018-07-16 | 25.88 | 22.082 |
| 2018-07-17 | 25.875 | 22.1 |
| 2018-07-18 | 25.855 | 22.268 |
| 2018-07-19 | 25.92 | 22.368 |
| 2018-07-20 | 25.875 | 22.175 |
| 2018-07-23 | 25.85 | 22.065 |
| 2018-07-24 | 25.76 | 22.006 |
| 2018-07-25 | 25.675 | 21.965 |
| 2018-07-26 | 25.645 | 21.891 |
| 2018-07-27 | 25.62 | 22.039 |
| 2018-07-30 | 25.625 | 21.931 |
| 2018-07-31 | 25.6 | 21.814 |
| 2018-08-01 | 25.59 | 21.889 |
| 2018-08-02 | 25.6 | 22.04 |
| 2018-08-03 | 25.66 | 22.144 |
| 2018-08-06 | 25.65 | 22.221 |
| 2018-08-07 | 25.605 | 22.072 |
| 2018-08-08 | 25.58 | 22.076 |
| 2018-08-09 | 25.57 | 22.057 |
| 2018-08-10 | 25.635 | 22.377 |
| 2018-08-13 | 25.66 | 22.503 |
| 2018-08-14 | 25.69 | 22.524 |
| 2018-08-15 | 25.71 | 22.709 |
| 2018-08-16 | 25.7 | 22.606 |
| 2018-08-17 | 25.73 | 22.583 |
| 2018-08-20 | 25.705 | 22.509 |
| 2018-08-21 | 25.74 | 22.376 |
| 2018-08-22 | 25.725 | 22.149 |
| 2018-08-23 | 25.71 | 22.207 |
| 2018-08-24 | 25.745 | 22.218 |
| 2018-08-27 | 25.745 | 22.127 |
| 2018-08-28 | 25.72 | 21.963 |
| 2018-08-29 | 25.745 | 22.08 |
| 2018-08-30 | 25.75 | 22.025 |
| 2018-08-31 | 25.735 | 22.089 |
| 2018-09-03 | 25.75 | 22.183 |
| 2018-09-04 | 25.73 | 22.256 |
| 2018-09-05 | 25.745 | 22.238 |
| 2018-09-06 | 25.715 | 22.09 |
| 2018-09-07 | 25.695 | 22.124 |
| 2018-09-10 | 25.65 | 22.166 |
| 2018-09-11 | 25.65 | 22.157 |
| 2018-09-12 | 25.59 | 22.096 |
| 2018-09-13 | 25.52 | 21.965 |
| 2018-09-14 | 25.475 | 21.79 |
| 2018-09-17 | 25.455 | 21.811 |
| 2018-09-18 | 25.45 | 21.761 |
| 2018-09-19 | 25.43 | 21.796 |
| 2018-09-20 | 25.56 | 21.71 |
| 2018-09-21 | 25.585 | 21.756 |
| 2018-09-24 | 25.615 | 21.763 |
| 2018-09-25 | 25.615 | 21.752 |
| 2018-09-26 | 25.605 | 21.819 |
| 2018-09-27 | 25.715 | 21.967 |
| 2018-10-01 | 25.765 | 22.201 |
| 2018-10-02 | 25.79 | 22.343 |
| 2018-10-03 | 25.78 | 22.329 |
| 2018-10-04 | 25.78 | 22.415 |
| 2018-10-05 | 25.74 | 22.372 |
| 2018-10-08 | 25.735 | 22.426 |
| 2018-10-09 | 25.805 | 22.564 |
| 2018-10-10 | 25.805 | 22.44 |
| 2018-10-11 | 25.85 | 22.335 |
| 2018-10-12 | 25.775 | 22.269 |
| 2018-10-15 | 25.8 | 22.277 |
| 2018-10-16 | 25.815 | 22.283 |
| 2018-10-17 | 25.845 | 22.418 |
| 2018-10-18 | 25.86 | 22.476 |
| 2018-10-19 | 25.865 | 22.552 |
| 2018-10-22 | 25.84 | 22.483 |
| 2018-10-23 | 25.815 | 22.49 |
| 2018-10-24 | 25.83 | 22.685 |
| 2018-10-25 | 25.83 | 22.627 |
| 2018-10-26 | 25.86 | 22.797 |
| 2018-10-29 | 25.85 | 22.715 |
| 2018-10-30 | 25.87 | 22.75 |
| 2018-10-31 | 25.92 | 22.902 |
| 2018-11-01 | 25.875 | 22.712 |
| 2018-11-02 | 25.78 | 22.581 |
| 2018-11-05 | 25.845 | 22.73 |
| 2018-11-06 | 25.835 | 22.606 |
| 2018-11-07 | 25.88 | 22.531 |
| 2018-11-08 | 25.885 | 22.653 |
| 2018-11-09 | 25.935 | 22.857 |
| 2018-11-12 | 25.94 | 23.029 |
| 2018-11-13 | 25.94 | 23.032 |
| 2018-11-14 | 25.995 | 23.013 |
| 2018-11-15 | 25.985 | 22.992 |
| 2018-11-16 | 25.985 | 22.903 |
| 2018-11-19 | 26.01 | 22.761 |
| 2018-11-20 | 26.03 | 22.794 |
| 2018-11-21 | 26 | 22.788 |
| 2018-11-22 | 25.99 | 22.79 |
| 2018-11-23 | 25.955 | 22.866 |
| 2018-11-26 | 25.92 | 22.808 |
| 2018-11-27 | 25.915 | 22.874 |
| 2018-11-28 | 25.93 | 22.977 |
| 2018-11-29 | 25.965 | 22.802 |
| 2018-11-30 | 25.955 | 22.848 |
| 2018-12-03 | 25.92 | 22.874 |
| 2018-12-04 | 25.9 | 22.702 |
| 2018-12-05 | 25.885 | 22.802 |
| 2018-12-06 | 25.89 | 22.796 |
| 2018-12-07 | 25.85 | 22.736 |
| 2018-12-10 | 25.865 | 22.64 |
| 2018-12-11 | 25.845 | 22.711 |
| 2018-12-12 | 25.865 | 22.796 |
| 2018-12-13 | 25.83 | 22.716 |
| 2018-12-14 | 25.795 | 22.858 |
| 2018-12-17 | 25.8 | 22.749 |
| 2018-12-18 | 25.755 | 22.638 |
| 2018-12-19 | 25.76 | 22.591 |
| 2018-12-20 | 25.76 | 22.497 |
| 2018-12-21 | 25.855 | 22.654 |
| 2018-12-27 | 25.86 | 22.733 |
| 2018-12-28 | 25.78 | 22.506 |
| 2018-12-31 | 25.725 | 22.466 |
| 2019-01-02 | 25.75 | 22.594 |
| 2019-01-03 | 25.68 | 22.634 |
| 2019-01-04 | 25.65 | 22.494 |
| 2019-01-07 | 25.575 | 22.347 |
| 2019-01-08 | 25.64 | 22.416 |
| 2019-01-09 | 25.63 | 22.376 |
| 2019-01-10 | 25.625 | 22.221 |
| 2019-01-11 | 25.605 | 22.199 |
| 2019-01-14 | 25.56 | 22.29 |
| 2019-01-15 | 25.57 | 22.382 |
| 2019-01-16 | 25.565 | 22.446 |
| 2019-01-17 | 25.535 | 22.407 |
| 2019-01-18 | 25.58 | 22.432 |
| 2019-01-21 | 25.595 | 22.528 |
| 2019-01-22 | 25.61 | 22.559 |
| 2019-01-23 | 25.695 | 22.605 |
| 2019-01-24 | 25.695 | 22.659 |
| 2019-01-25 | 25.695 | 22.644 |
| 2019-01-28 | 25.725 | 22.529 |
| 2019-01-29 | 25.745 | 22.541 |
| 2019-01-30 | 25.8 | 22.579 |
| 2019-01-31 | 25.76 | 22.427 |
| 2019-02-01 | 25.695 | 22.398 |
| 2019-02-04 | 25.73 | 22.48 |
| 2019-02-05 | 25.7 | 22.508 |
| 2019-02-06 | 25.785 | 22.629 |
| 2019-02-07 | 25.805 | 22.747 |
| 2019-02-08 | 25.805 | 22.745 |
| 2019-02-11 | 25.835 | 22.845 |
| 2019-02-12 | 25.87 | 22.901 |
| 2019-02-13 | 25.795 | 22.819 |
| 2019-02-14 | 25.79 | 22.885 |
| 2019-02-15 | 25.7 | 22.823 |
| 2019-02-18 | 25.715 | 22.703 |
| 2019-02-19 | 25.715 | 22.771 |
| 2019-02-20 | 25.68 | 22.646 |
| 2019-02-21 | 25.645 | 22.586 |
| 2019-02-22 | 25.665 | 22.662 |
| 2019-02-25 | 25.65 | 22.589 |
| 2019-02-26 | 25.665 | 22.594 |
| 2019-02-27 | 25.655 | 22.532 |
| 2019-02-28 | 25.6 | 22.425 |
| 2019-03-01 | 25.635 | 22.52 |
| 2019-03-04 | 25.625 | 22.6 |
| 2019-03-05 | 25.62 | 22.614 |
| 2019-03-06 | 25.595 | 22.641 |
| 2019-03-07 | 25.61 | 22.72 |
| 2019-03-08 | 25.64 | 22.848 |
| 2019-03-11 | 25.655 | 22.818 |
| 2019-03-12 | 25.67 | 22.768 |
| 2019-03-13 | 25.67 | 22.711 |
| 2019-03-14 | 25.67 | 22.724 |
| 2019-03-15 | 25.67 | 22.694 |
| 2019-03-18 | 25.615 | 22.571 |
| 2019-03-19 | 25.6 | 22.537 |
| 2019-03-20 | 25.645 | 22.587 |
| 2019-03-21 | 25.65 | 22.528 |
| 2019-03-22 | 25.725 | 22.761 |
| 2019-03-25 | 25.76 | 22.752 |
| 2019-03-26 | 25.77 | 22.823 |
| 2019-03-27 | 25.8 | 22.912 |
| 2019-03-28 | 25.78 | 22.934 |
| 2019-03-29 | 25.8 | 22.968 |
| 2019-04-01 | 25.79 | 22.955 |
| 2019-04-02 | 25.75 | 22.99 |
| 2019-04-03 | 25.725 | 22.876 |
| 2019-04-04 | 25.695 | 22.91 |
| 2019-04-05 | 25.61 | 22.8 |
| 2019-04-08 | 25.635 | 22.794 |
| 2019-04-09 | 25.62 | 22.716 |
| 2019-04-10 | 25.61 | 22.711 |
| 2019-04-11 | 25.605 | 22.732 |
| 2019-04-12 | 25.62 | 22.633 |
| 2019-04-15 | 25.625 | 22.653 |
| 2019-04-16 | 25.665 | 22.701 |
| 2019-04-17 | 25.655 | 22.702 |
| 2019-04-18 | 25.68 | 22.826 |
| 2019-04-23 | 25.745 | 22.896 |
| 2019-04-24 | 25.73 | 22.95 |
| 2019-04-25 | 25.735 | 23.137 |
| 2019-04-26 | 25.705 | 23.091 |
| 2019-04-29 | 25.68 | 23.028 |
| 2019-04-30 | 25.66 | 22.864 |
| 2019-05-02 | 25.645 | 22.875 |
| 2019-05-03 | 25.715 | 23.055 |
| 2019-05-06 | 25.715 | 22.962 |
| 2019-05-07 | 25.73 | 23.005 |
| 2019-05-09 | 25.72 | 22.983 |
| 2019-05-10 | 25.73 | 22.915 |
| 2019-05-13 | 25.775 | 22.918 |
| 2019-05-14 | 25.75 | 22.942 |
| 2019-05-15 | 25.76 | 23.035 |
| 2019-05-16 | 25.695 | 22.933 |
| 2019-05-17 | 25.75 | 23.048 |
| 2019-05-20 | 25.765 | 23.073 |
| 2019-05-21 | 25.775 | 23.096 |
| 2019-05-22 | 25.79 | 23.089 |
| 2019-05-23 | 25.82 | 23.181 |
| 2019-05-24 | 25.83 | 23.091 |
| 2019-05-27 | 25.835 | 23.074 |
| 2019-05-28 | 25.845 | 23.092 |
| 2019-05-29 | 25.86 | 23.179 |
| 2019-05-30 | 25.84 | 23.208 |
| 2019-05-31 | 25.817 | 23.153 |
| 2019-06-03 | 25.83 | 23.093 |
| 2019-06-04 | 25.745 | 22.906 |
| 2019-06-05 | 25.65 | 22.77 |
| 2019-06-06 | 25.66 | 22.775 |
| 2019-06-07 | 25.64 | 22.745 |
| 2019-06-10 | 25.625 | 22.675 |
| 2019-06-11 | 25.64 | 22.651 |
| 2019-06-12 | 25.615 | 22.623 |
| 2019-06-13 | 25.58 | 22.659 |
| 2019-06-14 | 25.54 | 22.674 |
| 2019-06-17 | 25.56 | 22.752 |
| 2019-06-18 | 25.61 | 22.797 |
| 2019-06-19 | 25.635 | 22.874 |
| 2019-06-20 | 25.62 | 22.663 |
| 2019-06-21 | 25.61 | 22.632 |
| 2019-06-24 | 25.6 | 22.465 |
| 2019-06-25 | 25.555 | 22.438 |
| 2019-06-26 | 25.485 | 22.434 |
| 2019-06-27 | 25.435 | 22.372 |
| 2019-06-28 | 25.445 | 22.363 |
| 2019-07-01 | 25.48 | 22.453 |
| 2019-07-02 | 25.46 | 22.527 |
| 2019-07-03 | 25.455 | 22.535 |
| 2019-07-04 | 25.435 | 22.534 |
| 2019-07-08 | 25.51 | 22.745 |
| 2019-07-09 | 25.545 | 22.8 |
| 2019-07-10 | 25.565 | 22.785 |
| 2019-07-11 | 25.605 | 22.689 |
| 2019-07-12 | 25.59 | 22.742 |
| 2019-07-15 | 25.575 | 22.694 |
| 2019-07-16 | 25.575 | 22.796 |
| 2019-07-17 | 25.605 | 22.829 |
| 2019-07-18 | 25.585 | 22.811 |
| 2019-07-19 | 25.545 | 22.756 |